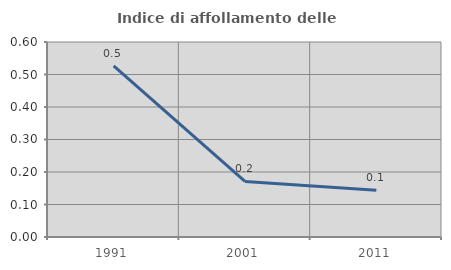
| Category | Indice di affollamento delle abitazioni  |
|---|---|
| 1991.0 | 0.526 |
| 2001.0 | 0.171 |
| 2011.0 | 0.144 |